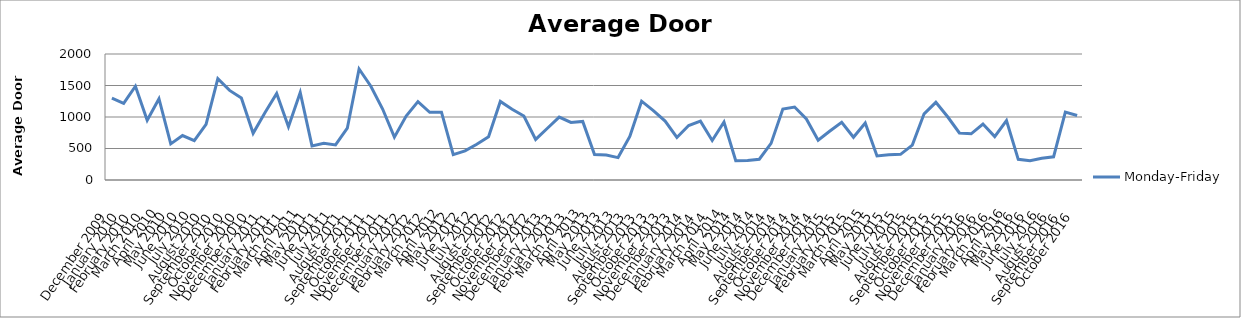
| Category | Monday-Friday |
|---|---|
| December 2009 | 1299.573 |
| January 2010 | 1215.272 |
| February 2010 | 1488.727 |
| March 2010 | 947.443 |
| April 2010 | 1290.554 |
| May 2010 | 573.778 |
| June 2010 | 706.276 |
| July 2010 | 624.685 |
| August 2010 | 883.379 |
| September 2010 | 1608.273 |
| October 2010 | 1421.979 |
| November 2010 | 1303.106 |
| December 2010 | 740.575 |
| January 2011 | 1068.176 |
| February 2011 | 1372.215 |
| March 2011 | 846.769 |
| April 2011 | 1390.038 |
| May 2011 | 541.802 |
| June 2011 | 584.46 |
| July 2011 | 557.612 |
| August 2011 | 821.802 |
| September 2011 | 1762.629 |
| October 2011 | 1488.955 |
| November 2011 | 1126.811 |
| December 2011 | 680.276 |
| January 2012 | 1014.224 |
| February 2012 | 1243.354 |
| March 2012 | 1074.96 |
| April 2012 | 1076.262 |
| May 2012 | 401.722 |
| June 2012 | 461.744 |
| July 2012 | 568.563 |
| August 2012 | 685.921 |
| September 2012 | 1247.383 |
| October 2012 | 1124.103 |
| November 2012 | 1015.722 |
| December 2012 | 644.176 |
| January 2013 | 820.878 |
| February 2013 | 999.196 |
| March 2013 | 913.943 |
| April 2013 | 929.717 |
| May 2013 | 403.364 |
| June 2013 | 398.141 |
| July 2013 | 355.724 |
| August 2013 | 691.478 |
| September 2013 | 1251.51 |
| October 2013 | 1100.536 |
| November 2013 | 934.42 |
| December 2013 | 674.986 |
| January 2014 | 864.537 |
| February 2014 | 934.148 |
| March 2014 | 626.711 |
| April 2014 | 921.31 |
| May 2014 | 307.066 |
| June 2014 | 309.236 |
| July 2014 | 329.194 |
| August 2014 | 581.344 |
| September 2014 | 1124.933 |
| October 2014 | 1158.508 |
| November 2014 | 969.572 |
| December 2014 | 632.753 |
| January 2015 | 777.562 |
| February 2015 | 916.728 |
| March 2015 | 678.528 |
| April 2015 | 905.631 |
| May 2015 | 381.248 |
| June 2015 | 400.097 |
| July 2015 | 406.835 |
| August 2015 | 553.288 |
| September 2015 | 1050.133 |
| October 2015 | 1233.211 |
| November 2015 | 1003.512 |
| December 2015 | 747.138 |
| January 2016 | 733.346 |
| February 2016 | 889.024 |
| March 2016 | 688.244 |
| April 2016 | 942.409 |
| May 2016 | 328.055 |
| June 2016 | 304.128 |
| July 2016 | 343.934 |
| August 2016 | 367.619 |
| September 2016 | 1078.838 |
| October 2016 | 1024.469 |